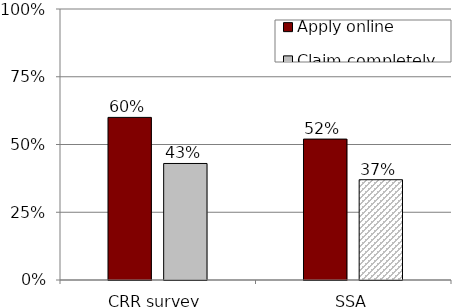
| Category | Apply online | Claim completely online |
|---|---|---|
| CRR survey | 0.6 | 0.43 |
| SSA | 0.52 | 0.37 |